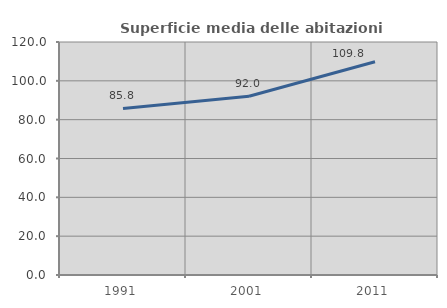
| Category | Superficie media delle abitazioni occupate |
|---|---|
| 1991.0 | 85.781 |
| 2001.0 | 92.046 |
| 2011.0 | 109.844 |